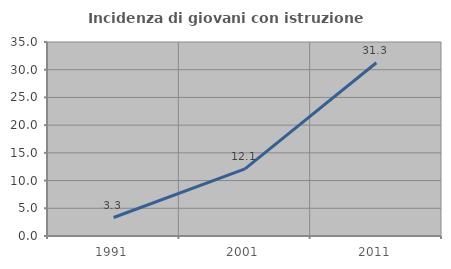
| Category | Incidenza di giovani con istruzione universitaria |
|---|---|
| 1991.0 | 3.333 |
| 2001.0 | 12.121 |
| 2011.0 | 31.25 |